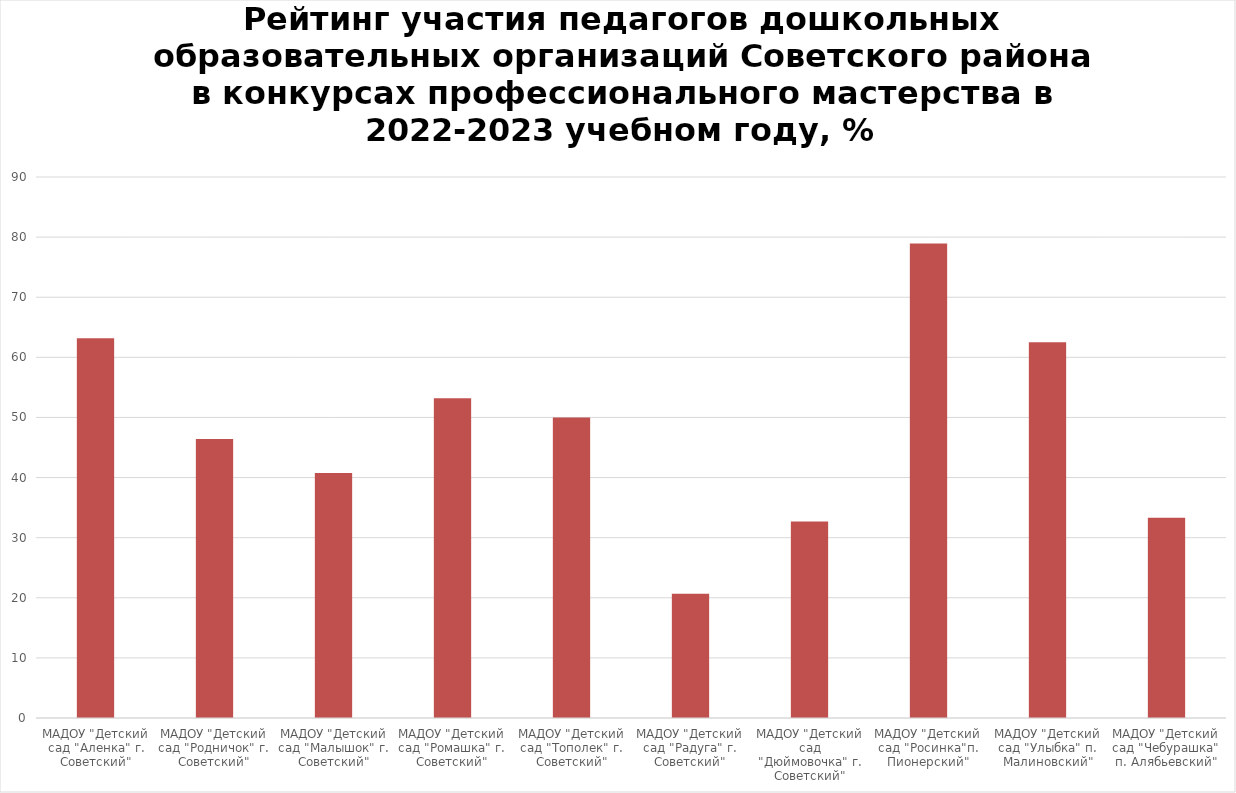
| Category | Доля участия, % |
|---|---|
| МАДОУ "Детский сад "Аленка" г. Советский" | 63.158 |
| МАДОУ "Детский сад "Родничок" г. Советский" | 46.429 |
| МАДОУ "Детский сад "Малышок" г. Советский" | 40.741 |
| МАДОУ "Детский сад "Ромашка" г. Советский" | 53.191 |
| МАДОУ "Детский сад "Тополек" г. Советский" | 50 |
| МАДОУ "Детский сад "Радуга" г. Советский" | 20.69 |
| МАДОУ "Детский сад "Дюймовочка" г. Советский" | 32.692 |
| МАДОУ "Детский сад "Росинка"п. Пионерский" | 78.947 |
| МАДОУ "Детский сад "Улыбка" п. Малиновский" | 62.5 |
| МАДОУ "Детский сад "Чебурашка" п. Алябьевский" | 33.333 |